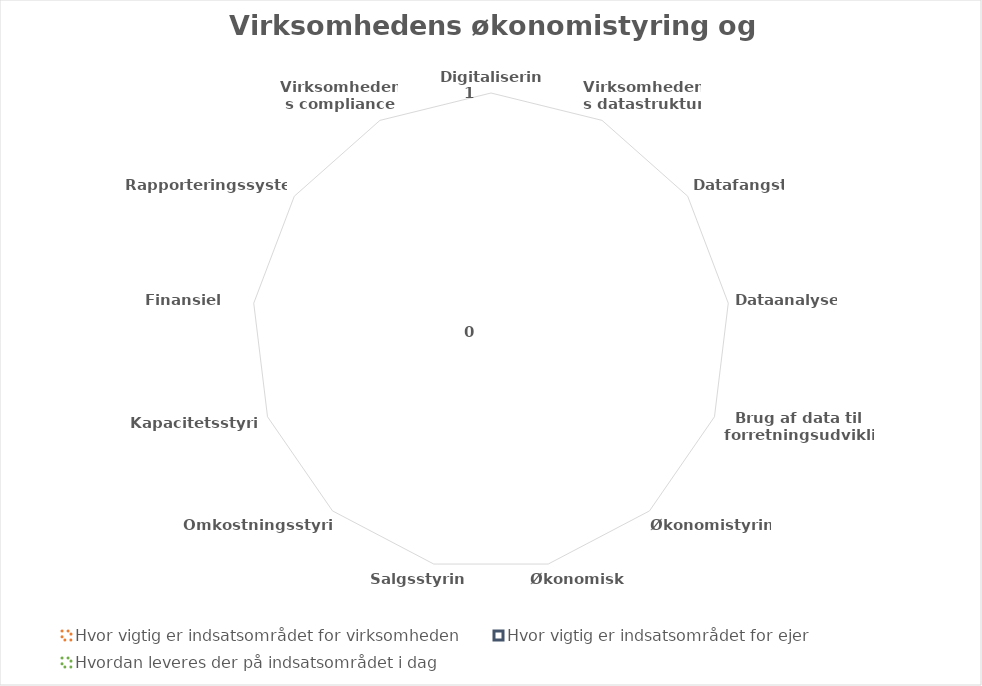
| Category | Hvor vigtig er indsatsområdet for virksomheden | Hvor vigtig er indsatsområdet for ejer | Hvordan leveres der på indsatsområdet i dag |
|---|---|---|---|
| Digitalisering | 0 | 0 | 0 |
| Virksomhedens datastruktur | 0 | 0 | 0 |
| Datafangst  | 0 | 0 | 0 |
| Dataanalyse  | 0 | 0 | 0 |
| Brug af data til forretningsudvikling | 0 | 0 | 0 |
| Økonomistyring | 0 | 0 | 0 |
| Økonomisk målstyring | 0 | 0 | 0 |
| Salgsstyring | 0 | 0 | 0 |
| Omkostningsstyring | 0 | 0 | 0 |
| Kapacitetsstyring | 0 | 0 | 0 |
| Finansiel styring | 0 | 0 | 0 |
| Rapporteringssystem | 0 | 0 | 0 |
| Virksomhedens compliance | 0 | 0 | 0 |